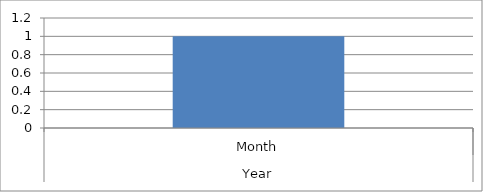
| Category | Status |
|---|---|
| 0 | 1 |